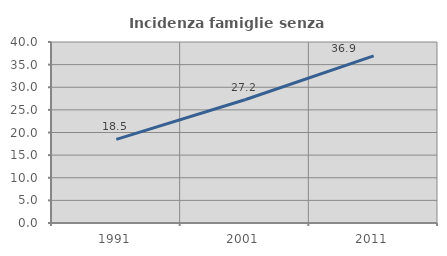
| Category | Incidenza famiglie senza nuclei |
|---|---|
| 1991.0 | 18.474 |
| 2001.0 | 27.24 |
| 2011.0 | 36.949 |